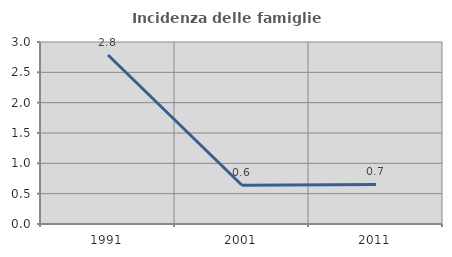
| Category | Incidenza delle famiglie numerose |
|---|---|
| 1991.0 | 2.786 |
| 2001.0 | 0.638 |
| 2011.0 | 0.653 |